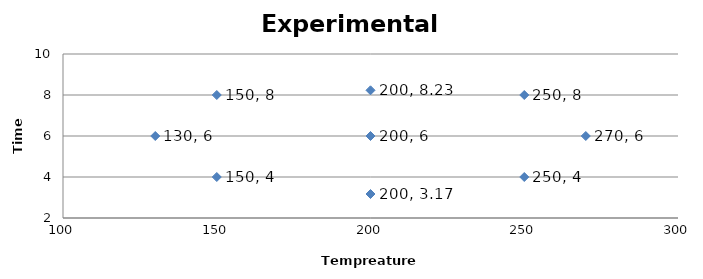
| Category | Series 0 |
|---|---|
| 130.0 | 6 |
| 150.0 | 4 |
| 150.0 | 8 |
| 200.0 | 3.17 |
| 200.0 | 6 |
| 200.0 | 8.23 |
| 250.0 | 4 |
| 250.0 | 8 |
| 270.0 | 6 |